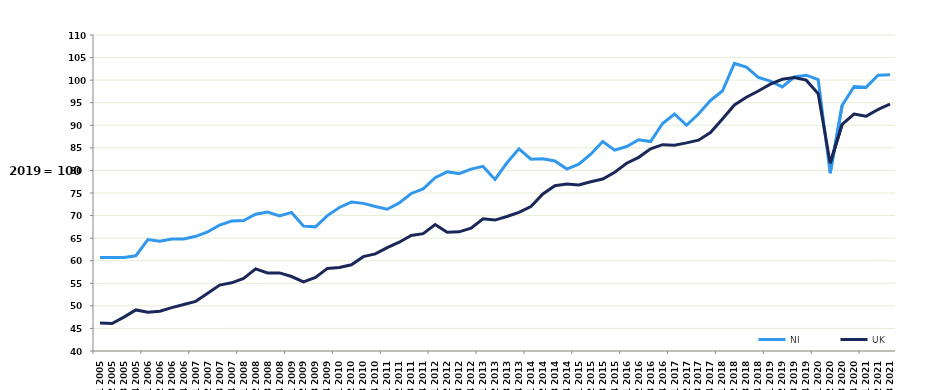
| Category | NI | UK |
|---|---|---|
| Q1 2005 | 60.7 | 46.2 |
| Q2 2005 | 60.7 | 46.1 |
| Q3 2005 | 60.7 | 47.5 |
| Q4 2005 | 61.1 | 49.1 |
| Q1 2006 | 64.7 | 48.6 |
| Q2 2006 | 64.3 | 48.8 |
| Q3 2006 | 64.8 | 49.6 |
| Q4 2006 | 64.8 | 50.3 |
| Q1 2007 | 65.4 | 51 |
| Q2 2007 | 66.4 | 52.8 |
| Q3 2007 | 67.9 | 54.6 |
| Q4 2007 | 68.8 | 55.1 |
| Q1 2008 | 68.9 | 56.1 |
| Q2 2008 | 70.3 | 58.2 |
| Q3 2008 | 70.8 | 57.3 |
| Q4 2008 | 69.9 | 57.3 |
| Q1 2009 | 70.7 | 56.5 |
| Q2 2009 | 67.7 | 55.3 |
| Q3 2009 | 67.5 | 56.3 |
| Q4 2009 | 70 | 58.3 |
| Q1 2010 | 71.8 | 58.5 |
| Q2 2010 | 73 | 59.1 |
| Q3 2010 | 72.7 | 60.9 |
| Q4 2010 | 72 | 61.5 |
| Q1 2011 | 71.4 | 62.9 |
| Q2 2011 | 72.8 | 64.1 |
| Q3 2011 | 74.9 | 65.6 |
| Q4 2011 | 75.9 | 66 |
| Q1 2012 | 78.4 | 68 |
| Q2 2012 | 79.7 | 66.3 |
| Q3 2012 | 79.3 | 66.4 |
| Q4 2012 | 80.3 | 67.2 |
| Q1 2013 | 80.9 | 69.3 |
| Q2 2013 | 78 | 69 |
| Q3 2013 | 81.7 | 69.8 |
| Q4 2013 | 84.8 | 70.7 |
| Q1 2014 | 82.5 | 72 |
| Q2 2014 | 82.6 | 74.8 |
| Q3 2014 | 82.1 | 76.6 |
| Q4 2014 | 80.3 | 77 |
| Q1 2015 | 81.4 | 76.8 |
| Q2 2015 | 83.6 | 77.5 |
| Q3 2015 | 86.4 | 78.1 |
| Q4 2015 | 84.5 | 79.6 |
| Q1 2016 | 85.3 | 81.6 |
| Q2 2016 | 86.8 | 82.9 |
| Q3 2016 | 86.4 | 84.8 |
| Q4 2016 | 90.4 | 85.7 |
| Q1 2017 | 92.5 | 85.6 |
| Q2 2017 | 90 | 86.1 |
| Q3 2017 | 92.5 | 86.7 |
| Q4 2017 | 95.5 | 88.4 |
| Q1 2018 | 97.6 | 91.4 |
| Q2 2018 | 103.7 | 94.5 |
| Q3 2018 | 102.9 | 96.2 |
| Q4 2018 | 100.6 | 97.6 |
| Q1 2019 | 99.8 | 99.1 |
| Q2 2019 | 98.5 | 100.2 |
| Q3 2019 | 100.7 | 100.6 |
| Q4 2019 | 101.1 | 100 |
| Q1 2020 | 100.1 | 97 |
| Q2 2020 | 79.4 | 81.6 |
| Q3 2020 | 94.4 | 90.2 |
| Q4 2020 | 98.6 | 92.5 |
| Q1 2021 | 98.4 | 92 |
| Q2 2021 | 101.1 | 93.5 |
| Q3 2021 | 101.2 | 94.7 |